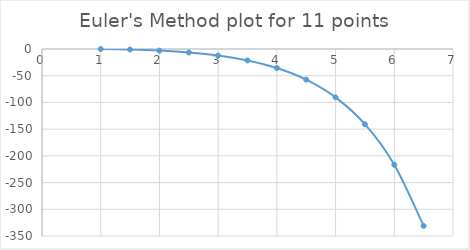
| Category | Series 0 |
|---|---|
| 1.0 | 0 |
| 1.5 | -1 |
| 2.0 | -3 |
| 2.5 | -6.5 |
| 3.0 | -12.25 |
| 3.5 | -21.375 |
| 4.0 | -35.562 |
| 4.5 | -57.344 |
| 5.0 | -90.516 |
| 5.5 | -140.773 |
| 6.0 | -216.66 |
| 6.5 | -330.99 |